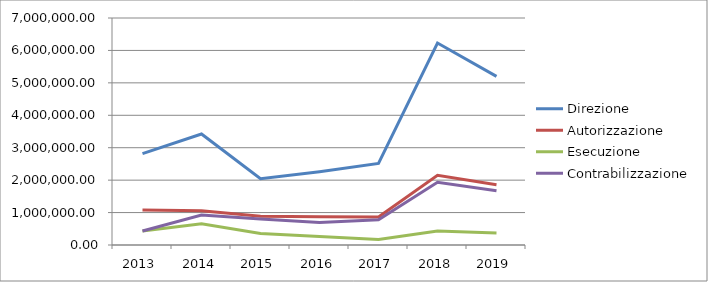
| Category | Direzione | Autorizzazione | Esecuzione | Contrabilizzazione |
|---|---|---|---|---|
| 2013.0 | 2815872.174 | 1083027.759 | 433211.104 | 433211.104 |
| 2014.0 | 3424085.775 | 1053564.854 | 658478.034 | 921869.247 |
| 2015.0 | 2046157.415 | 889633.659 | 355853.463 | 800670.293 |
| 2016.0 | 2260939.399 | 869592.077 | 260877.623 | 695673.661 |
| 2017.0 | 2513647.703 | 866775.07 | 173355.014 | 780097.563 |
| 2018.0 | 6228107.698 | 2147623.344 | 429524.669 | 1932861.01 |
| 2019.0 | 5199333.263 | 1856904.737 | 371380.947 | 1671214.263 |